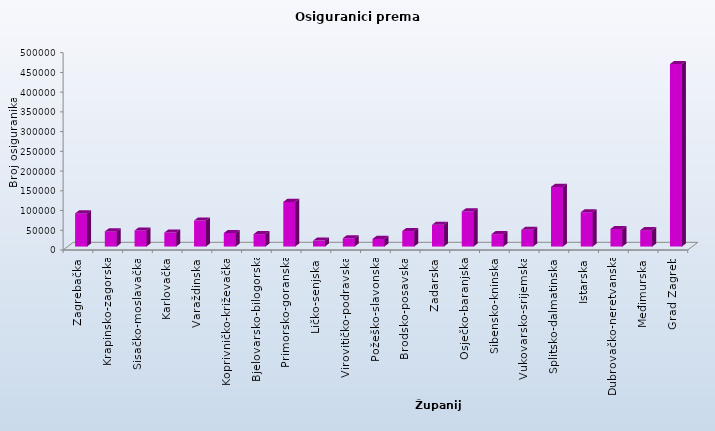
| Category | Series 0 |
|---|---|
| Zagrebačka | 83956 |
| Krapinsko-zagorska | 38357 |
| Sisačko-moslavačka | 40763 |
| Karlovačka | 35535 |
| Varaždinska | 65951 |
| Koprivničko-križevačka | 34259 |
| Bjelovarsko-bilogorska | 31370 |
| Primorsko-goranska | 113113 |
| Ličko-senjska | 15025 |
| Virovitičko-podravska | 21005 |
| Požeško-slavonska | 19300 |
| Brodsko-posavska | 39295 |
| Zadarska | 55109 |
| Osječko-baranjska | 88914 |
| Šibensko-kninska | 31514 |
| Vukovarsko-srijemska | 42327 |
| Splitsko-dalmatinska | 151126 |
| Istarska | 86937 |
| Dubrovačko-neretvanska | 44551 |
| Međimurska | 41506 |
| Grad Zagreb | 462415 |